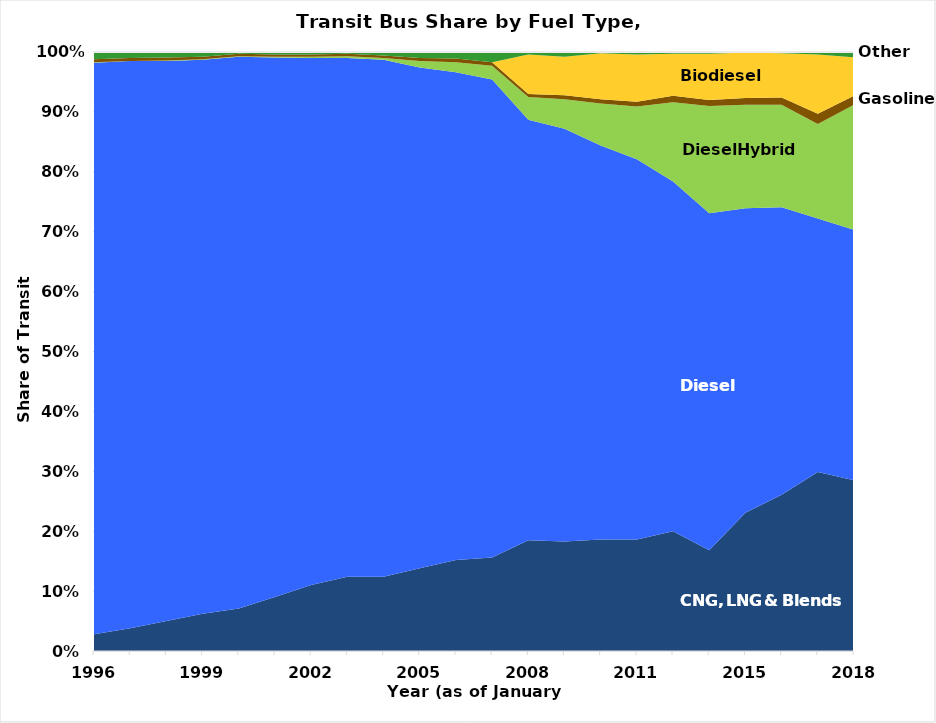
| Category | CNG, LNG, 
& Blends | Diesel | Hybrid | Gasoline | Biodiesel | Other |
|---|---|---|---|---|---|---|
| 1996.0 | 0.028 | 0.954 | 0.001 | 0.005 | 0 | 0.012 |
| 1997.0 | 0.038 | 0.947 | 0 | 0.005 | 0 | 0.011 |
| 1998.0 | 0.05 | 0.935 | 0.001 | 0.005 | 0 | 0.01 |
| 1999.0 | 0.062 | 0.925 | 0.001 | 0.004 | 0 | 0.008 |
| 2000.0 | 0.071 | 0.921 | 0.001 | 0.004 | 0 | 0.002 |
| 2001.0 | 0.09 | 0.901 | 0.001 | 0.004 | 0 | 0.003 |
| 2002.0 | 0.11 | 0.88 | 0.002 | 0.004 | 0 | 0.004 |
| 2003.0 | 0.124 | 0.866 | 0.003 | 0.004 | 0 | 0.004 |
| 2004.0 | 0.124 | 0.863 | 0.003 | 0.004 | 0 | 0.005 |
| 2005.0 | 0.138 | 0.836 | 0.011 | 0.005 | 0 | 0.009 |
| 2006.0 | 0.152 | 0.814 | 0.017 | 0.006 | 0 | 0.012 |
| 2007.0 | 0.156 | 0.798 | 0.023 | 0.006 | 0 | 0.017 |
| 2008.0 | 0.185 | 0.702 | 0.038 | 0.005 | 0.066 | 0.004 |
| 2009.0 | 0.183 | 0.689 | 0.049 | 0.007 | 0.064 | 0.008 |
| 2010.0 | 0.186 | 0.658 | 0.07 | 0.007 | 0.077 | 0.002 |
| 2011.0 | 0.186 | 0.635 | 0.088 | 0.008 | 0.079 | 0.004 |
| 2013.0 | 0.2 | 0.584 | 0.132 | 0.011 | 0.07 | 0.003 |
| 2014.0 | 0.168 | 0.563 | 0.179 | 0.01 | 0.077 | 0.003 |
| 2015.0 | 0.231 | 0.508 | 0.173 | 0.011 | 0.076 | 0.002 |
| 2016.0 | 0.261 | 0.48 | 0.171 | 0.012 | 0.074 | 0.002 |
| 2017.0 | 0.299 | 0.423 | 0.158 | 0.017 | 0.099 | 0.004 |
| 2018.0 | 0.285 | 0.418 | 0.209 | 0.015 | 0.064 | 0.009 |